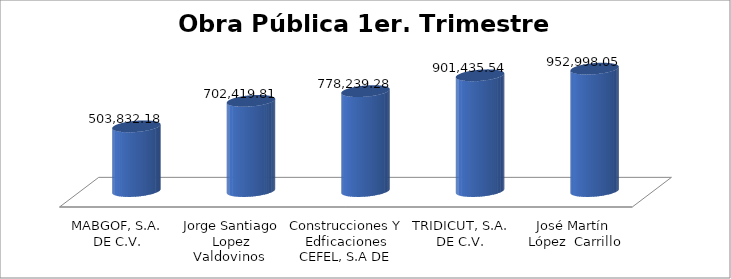
| Category | Suma  |
|---|---|
| MABGOF, S.A. DE C.V. | 503832.18 |
| Jorge Santiago Lopez Valdovinos  | 702419.81 |
| Construcciones Y Edficaciones CEFEL, S.A DE C.V.  | 778239.28 |
| TRIDICUT, S.A. DE C.V. | 901435.54 |
| José Martín  López  Carrillo | 952998.05 |